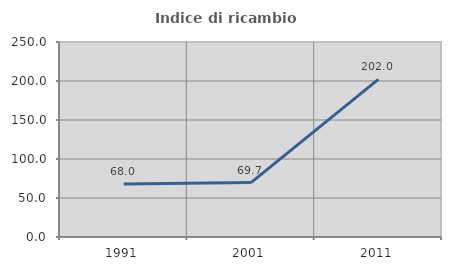
| Category | Indice di ricambio occupazionale  |
|---|---|
| 1991.0 | 67.961 |
| 2001.0 | 69.737 |
| 2011.0 | 202 |